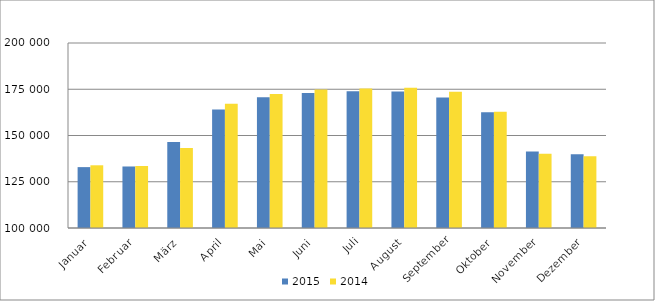
| Category | 2015 | 2014 |
|---|---|---|
| Januar | 132910 | 133898 |
| Februar | 133253 | 133529 |
| März | 146441 | 143294 |
| April | 164092 | 167208 |
| Mai | 170673 | 172494 |
| Juni | 172986 | 174799 |
| Juli | 173986 | 175426 |
| August | 173845 | 175825 |
| September | 170494 | 173684 |
| Oktober | 162573 | 162798 |
| November | 141310 | 140172 |
| Dezember | 139798 | 138827 |